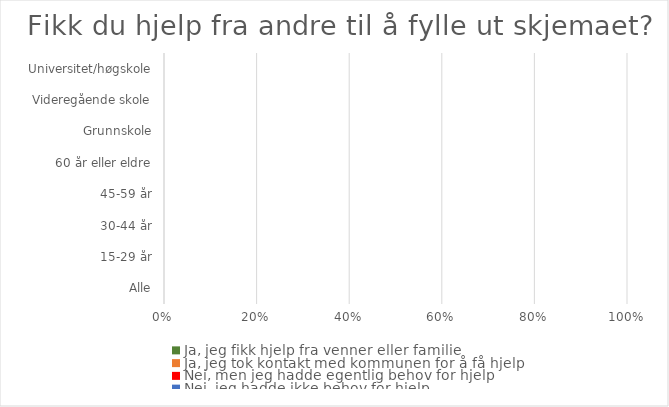
| Category | Ja, jeg fikk hjelp fra venner eller familie | Ja, jeg tok kontakt med kommunen for å få hjelp | Nei, men jeg hadde egentlig behov for hjelp | Nei, jeg hadde ikke behov for hjelp |
|---|---|---|---|---|
| Alle | 0 | 0 | 0 | 0 |
| 15-29 år | 0 | 0 | 0 | 0 |
| 30-44 år | 0 | 0 | 0 | 0 |
| 45-59 år | 0 | 0 | 0 | 0 |
| 60 år eller eldre | 0 | 0 | 0 | 0 |
| Grunnskole | 0 | 0 | 0 | 0 |
| Videregående skole | 0 | 0 | 0 | 0 |
| Universitet/høgskole | 0 | 0 | 0 | 0 |